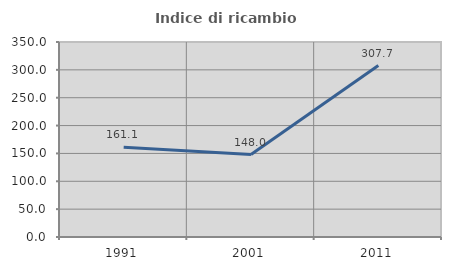
| Category | Indice di ricambio occupazionale  |
|---|---|
| 1991.0 | 161.053 |
| 2001.0 | 148 |
| 2011.0 | 307.692 |